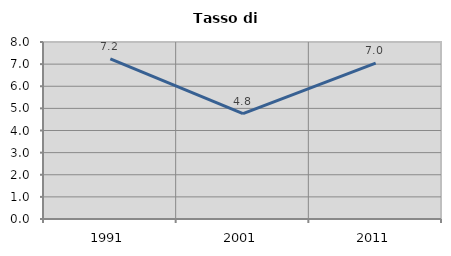
| Category | Tasso di disoccupazione   |
|---|---|
| 1991.0 | 7.237 |
| 2001.0 | 4.762 |
| 2011.0 | 7.042 |